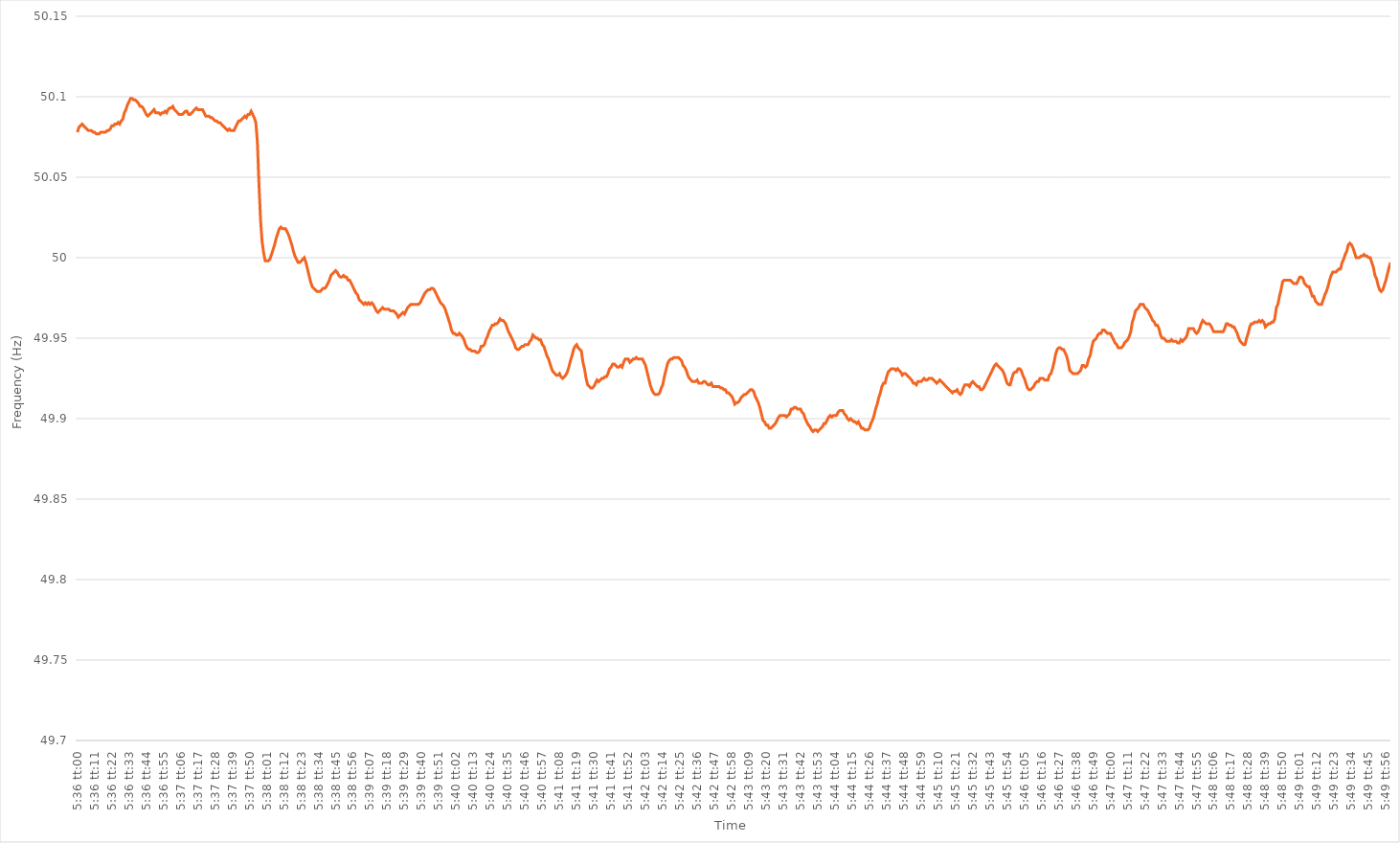
| Category | Series 0 |
|---|---|
| 0.2333333333333333 | 50.078 |
| 0.2333449074074074 | 50.081 |
| 0.23335648148148147 | 50.082 |
| 0.23336805555555554 | 50.083 |
| 0.23337962962962963 | 50.082 |
| 0.2333912037037037 | 50.081 |
| 0.23340277777777776 | 50.08 |
| 0.23341435185185186 | 50.079 |
| 0.23342592592592593 | 50.079 |
| 0.2334375 | 50.079 |
| 0.2334490740740741 | 50.078 |
| 0.23346064814814815 | 50.078 |
| 0.23347222222222222 | 50.077 |
| 0.23348379629629631 | 50.077 |
| 0.23349537037037038 | 50.077 |
| 0.23350694444444445 | 50.078 |
| 0.23351851851851854 | 50.078 |
| 0.23353009259259258 | 50.078 |
| 0.23354166666666668 | 50.078 |
| 0.23355324074074071 | 50.079 |
| 0.23356481481481484 | 50.079 |
| 0.23357638888888888 | 50.08 |
| 0.23358796296296294 | 50.082 |
| 0.23359953703703704 | 50.082 |
| 0.2336111111111111 | 50.083 |
| 0.23362268518518517 | 50.083 |
| 0.23363425925925926 | 50.084 |
| 0.23364583333333333 | 50.083 |
| 0.2336574074074074 | 50.085 |
| 0.2336689814814815 | 50.086 |
| 0.23368055555555556 | 50.09 |
| 0.23369212962962962 | 50.092 |
| 0.23370370370370372 | 50.095 |
| 0.23371527777777779 | 50.097 |
| 0.23372685185185185 | 50.099 |
| 0.23373842592592595 | 50.099 |
| 0.23375 | 50.098 |
| 0.23376157407407408 | 50.098 |
| 0.23377314814814812 | 50.097 |
| 0.23378472222222224 | 50.096 |
| 0.23379629629629628 | 50.094 |
| 0.23380787037037035 | 50.094 |
| 0.23381944444444444 | 50.093 |
| 0.2338310185185185 | 50.091 |
| 0.23384259259259257 | 50.089 |
| 0.23385416666666667 | 50.088 |
| 0.23386574074074074 | 50.089 |
| 0.2338773148148148 | 50.09 |
| 0.2338888888888889 | 50.091 |
| 0.23390046296296296 | 50.092 |
| 0.23391203703703703 | 50.09 |
| 0.23392361111111112 | 50.09 |
| 0.2339351851851852 | 50.09 |
| 0.23394675925925926 | 50.089 |
| 0.23395833333333335 | 50.09 |
| 0.23396990740740742 | 50.09 |
| 0.23398148148148148 | 50.091 |
| 0.23399305555555558 | 50.09 |
| 0.23400462962962965 | 50.092 |
| 0.23401620370370368 | 50.093 |
| 0.2340277777777778 | 50.093 |
| 0.23403935185185185 | 50.094 |
| 0.2340509259259259 | 50.092 |
| 0.23406249999999998 | 50.091 |
| 0.23407407407407407 | 50.09 |
| 0.23408564814814814 | 50.089 |
| 0.2340972222222222 | 50.089 |
| 0.2341087962962963 | 50.089 |
| 0.23412037037037037 | 50.09 |
| 0.23413194444444443 | 50.091 |
| 0.23414351851851853 | 50.091 |
| 0.2341550925925926 | 50.089 |
| 0.23416666666666666 | 50.089 |
| 0.23417824074074076 | 50.09 |
| 0.23418981481481482 | 50.091 |
| 0.2342013888888889 | 50.092 |
| 0.23421296296296298 | 50.093 |
| 0.23422453703703705 | 50.092 |
| 0.2342361111111111 | 50.092 |
| 0.2342476851851852 | 50.092 |
| 0.23425925925925925 | 50.092 |
| 0.23427083333333334 | 50.09 |
| 0.23428240740740738 | 50.088 |
| 0.23429398148148148 | 50.088 |
| 0.23430555555555554 | 50.088 |
| 0.2343171296296296 | 50.087 |
| 0.2343287037037037 | 50.087 |
| 0.23434027777777777 | 50.086 |
| 0.23435185185185184 | 50.085 |
| 0.23436342592592593 | 50.085 |
| 0.234375 | 50.084 |
| 0.23438657407407407 | 50.084 |
| 0.23439814814814816 | 50.083 |
| 0.23440972222222223 | 50.082 |
| 0.2344212962962963 | 50.081 |
| 0.2344328703703704 | 50.08 |
| 0.23444444444444446 | 50.079 |
| 0.23445601851851852 | 50.08 |
| 0.23446759259259262 | 50.079 |
| 0.23447916666666666 | 50.079 |
| 0.23449074074074075 | 50.079 |
| 0.2345023148148148 | 50.081 |
| 0.2345138888888889 | 50.083 |
| 0.23452546296296295 | 50.085 |
| 0.23453703703703702 | 50.085 |
| 0.2345486111111111 | 50.086 |
| 0.23456018518518518 | 50.087 |
| 0.23457175925925924 | 50.088 |
| 0.23458333333333334 | 50.087 |
| 0.2345949074074074 | 50.089 |
| 0.23460648148148147 | 50.089 |
| 0.23461805555555557 | 50.091 |
| 0.23462962962962963 | 50.089 |
| 0.2346412037037037 | 50.087 |
| 0.2346527777777778 | 50.084 |
| 0.23466435185185186 | 50.072 |
| 0.23467592592592593 | 50.046 |
| 0.23468750000000002 | 50.024 |
| 0.2346990740740741 | 50.01 |
| 0.23471064814814815 | 50.003 |
| 0.2347222222222222 | 49.998 |
| 0.23473379629629632 | 49.998 |
| 0.23474537037037035 | 49.998 |
| 0.23475694444444442 | 49.999 |
| 0.23476851851851852 | 50.002 |
| 0.23478009259259258 | 50.005 |
| 0.23479166666666665 | 50.008 |
| 0.23480324074074074 | 50.012 |
| 0.2348148148148148 | 50.015 |
| 0.23482638888888888 | 50.018 |
| 0.23483796296296297 | 50.019 |
| 0.23484953703703704 | 50.018 |
| 0.2348611111111111 | 50.018 |
| 0.2348726851851852 | 50.018 |
| 0.23488425925925926 | 50.016 |
| 0.23489583333333333 | 50.014 |
| 0.23490740740740743 | 50.011 |
| 0.2349189814814815 | 50.008 |
| 0.23493055555555556 | 50.004 |
| 0.23494212962962965 | 50.001 |
| 0.23495370370370372 | 49.999 |
| 0.23496527777777776 | 49.997 |
| 0.23497685185185188 | 49.997 |
| 0.23498842592592592 | 49.998 |
| 0.235 | 49.999 |
| 0.23501157407407405 | 50 |
| 0.23502314814814815 | 49.997 |
| 0.23503472222222221 | 49.993 |
| 0.23504629629629628 | 49.989 |
| 0.23505787037037038 | 49.985 |
| 0.23506944444444444 | 49.982 |
| 0.2350810185185185 | 49.981 |
| 0.2350925925925926 | 49.98 |
| 0.23510416666666667 | 49.979 |
| 0.23511574074074074 | 49.979 |
| 0.23512731481481483 | 49.979 |
| 0.2351388888888889 | 49.98 |
| 0.23515046296296296 | 49.981 |
| 0.23516203703703706 | 49.981 |
| 0.23517361111111112 | 49.982 |
| 0.23518518518518516 | 49.984 |
| 0.23519675925925929 | 49.986 |
| 0.23520833333333332 | 49.989 |
| 0.23521990740740742 | 49.99 |
| 0.23523148148148146 | 49.991 |
| 0.23524305555555555 | 49.992 |
| 0.23525462962962962 | 49.991 |
| 0.23526620370370369 | 49.989 |
| 0.23527777777777778 | 49.988 |
| 0.23528935185185185 | 49.988 |
| 0.2353009259259259 | 49.989 |
| 0.2353125 | 49.988 |
| 0.23532407407407407 | 49.988 |
| 0.23533564814814814 | 49.986 |
| 0.23534722222222224 | 49.986 |
| 0.2353587962962963 | 49.984 |
| 0.23537037037037037 | 49.982 |
| 0.23538194444444446 | 49.98 |
| 0.23539351851851853 | 49.978 |
| 0.2354050925925926 | 49.977 |
| 0.2354166666666667 | 49.974 |
| 0.23542824074074073 | 49.973 |
| 0.23543981481481482 | 49.972 |
| 0.23545138888888886 | 49.971 |
| 0.23546296296296299 | 49.972 |
| 0.23547453703703702 | 49.971 |
| 0.2354861111111111 | 49.972 |
| 0.23549768518518518 | 49.971 |
| 0.23550925925925925 | 49.972 |
| 0.23552083333333332 | 49.971 |
| 0.2355324074074074 | 49.969 |
| 0.23554398148148148 | 49.967 |
| 0.23555555555555555 | 49.966 |
| 0.23556712962962964 | 49.967 |
| 0.2355787037037037 | 49.968 |
| 0.23559027777777777 | 49.969 |
| 0.23560185185185187 | 49.968 |
| 0.23561342592592593 | 49.968 |
| 0.235625 | 49.968 |
| 0.2356365740740741 | 49.968 |
| 0.23564814814814816 | 49.967 |
| 0.23565972222222223 | 49.967 |
| 0.23567129629629627 | 49.967 |
| 0.2356828703703704 | 49.966 |
| 0.23569444444444443 | 49.965 |
| 0.2357060185185185 | 49.963 |
| 0.2357175925925926 | 49.964 |
| 0.23572916666666666 | 49.965 |
| 0.23574074074074072 | 49.966 |
| 0.23575231481481482 | 49.965 |
| 0.23576388888888888 | 49.967 |
| 0.23577546296296295 | 49.969 |
| 0.23578703703703704 | 49.97 |
| 0.2357986111111111 | 49.971 |
| 0.23581018518518518 | 49.971 |
| 0.23582175925925927 | 49.971 |
| 0.23583333333333334 | 49.971 |
| 0.2358449074074074 | 49.971 |
| 0.2358564814814815 | 49.971 |
| 0.23586805555555557 | 49.972 |
| 0.23587962962962963 | 49.974 |
| 0.23589120370370367 | 49.976 |
| 0.2359027777777778 | 49.978 |
| 0.23591435185185183 | 49.979 |
| 0.23592592592592596 | 49.98 |
| 0.2359375 | 49.98 |
| 0.23594907407407406 | 49.981 |
| 0.23596064814814813 | 49.981 |
| 0.23597222222222222 | 49.98 |
| 0.2359837962962963 | 49.978 |
| 0.23599537037037036 | 49.976 |
| 0.23600694444444445 | 49.974 |
| 0.23601851851851852 | 49.972 |
| 0.23603009259259258 | 49.971 |
| 0.23604166666666668 | 49.97 |
| 0.23605324074074074 | 49.968 |
| 0.2360648148148148 | 49.965 |
| 0.2360763888888889 | 49.962 |
| 0.23608796296296297 | 49.959 |
| 0.23609953703703704 | 49.955 |
| 0.23611111111111113 | 49.953 |
| 0.2361226851851852 | 49.953 |
| 0.23613425925925924 | 49.952 |
| 0.23614583333333336 | 49.952 |
| 0.2361574074074074 | 49.953 |
| 0.2361689814814815 | 49.952 |
| 0.23618055555555553 | 49.951 |
| 0.23619212962962963 | 49.949 |
| 0.2362037037037037 | 49.946 |
| 0.23621527777777776 | 49.944 |
| 0.23622685185185185 | 49.943 |
| 0.23623842592592592 | 49.943 |
| 0.23625 | 49.942 |
| 0.23626157407407408 | 49.942 |
| 0.23627314814814815 | 49.942 |
| 0.23628472222222222 | 49.941 |
| 0.2362962962962963 | 49.941 |
| 0.23630787037037038 | 49.942 |
| 0.23631944444444444 | 49.945 |
| 0.23633101851851854 | 49.945 |
| 0.2363425925925926 | 49.946 |
| 0.23635416666666667 | 49.949 |
| 0.23636574074074077 | 49.951 |
| 0.2363773148148148 | 49.954 |
| 0.2363888888888889 | 49.956 |
| 0.23640046296296294 | 49.958 |
| 0.23641203703703703 | 49.958 |
| 0.2364236111111111 | 49.959 |
| 0.23643518518518516 | 49.959 |
| 0.23644675925925926 | 49.96 |
| 0.23645833333333333 | 49.962 |
| 0.2364699074074074 | 49.961 |
| 0.2364814814814815 | 49.961 |
| 0.23649305555555555 | 49.96 |
| 0.23650462962962962 | 49.958 |
| 0.23651620370370371 | 49.955 |
| 0.23652777777777778 | 49.953 |
| 0.23653935185185185 | 49.951 |
| 0.23655092592592594 | 49.949 |
| 0.2365625 | 49.947 |
| 0.23657407407407408 | 49.944 |
| 0.23658564814814817 | 49.943 |
| 0.23659722222222224 | 49.943 |
| 0.2366087962962963 | 49.944 |
| 0.23662037037037034 | 49.945 |
| 0.23663194444444446 | 49.945 |
| 0.2366435185185185 | 49.946 |
| 0.23665509259259257 | 49.946 |
| 0.23666666666666666 | 49.946 |
| 0.23667824074074073 | 49.948 |
| 0.2366898148148148 | 49.949 |
| 0.2367013888888889 | 49.952 |
| 0.23671296296296296 | 49.951 |
| 0.23672453703703702 | 49.95 |
| 0.23673611111111112 | 49.95 |
| 0.23674768518518519 | 49.949 |
| 0.23675925925925925 | 49.949 |
| 0.23677083333333335 | 49.946 |
| 0.2367824074074074 | 49.945 |
| 0.23679398148148148 | 49.942 |
| 0.23680555555555557 | 49.939 |
| 0.23681712962962964 | 49.937 |
| 0.2368287037037037 | 49.934 |
| 0.23684027777777775 | 49.931 |
| 0.23685185185185187 | 49.929 |
| 0.2368634259259259 | 49.928 |
| 0.23687500000000003 | 49.927 |
| 0.23688657407407407 | 49.927 |
| 0.23689814814814814 | 49.928 |
| 0.2369097222222222 | 49.926 |
| 0.2369212962962963 | 49.925 |
| 0.23693287037037036 | 49.926 |
| 0.23694444444444443 | 49.927 |
| 0.23695601851851852 | 49.929 |
| 0.2369675925925926 | 49.932 |
| 0.23697916666666666 | 49.936 |
| 0.23699074074074075 | 49.939 |
| 0.23700231481481482 | 49.943 |
| 0.23701388888888889 | 49.945 |
| 0.23702546296296298 | 49.946 |
| 0.23703703703703705 | 49.944 |
| 0.2370486111111111 | 49.943 |
| 0.2370601851851852 | 49.942 |
| 0.23707175925925927 | 49.935 |
| 0.2370833333333333 | 49.931 |
| 0.23709490740740743 | 49.925 |
| 0.23710648148148147 | 49.921 |
| 0.23711805555555557 | 49.92 |
| 0.2371296296296296 | 49.919 |
| 0.2371412037037037 | 49.919 |
| 0.23715277777777777 | 49.92 |
| 0.23716435185185183 | 49.922 |
| 0.23717592592592593 | 49.924 |
| 0.2371875 | 49.923 |
| 0.23719907407407406 | 49.924 |
| 0.23721064814814816 | 49.925 |
| 0.23722222222222222 | 49.925 |
| 0.2372337962962963 | 49.926 |
| 0.23724537037037038 | 49.926 |
| 0.23725694444444445 | 49.928 |
| 0.23726851851851852 | 49.931 |
| 0.2372800925925926 | 49.932 |
| 0.23729166666666668 | 49.934 |
| 0.23730324074074075 | 49.934 |
| 0.23731481481481484 | 49.933 |
| 0.23732638888888888 | 49.932 |
| 0.23733796296296297 | 49.932 |
| 0.237349537037037 | 49.933 |
| 0.2373611111111111 | 49.932 |
| 0.23737268518518517 | 49.935 |
| 0.23738425925925924 | 49.937 |
| 0.23739583333333333 | 49.937 |
| 0.2374074074074074 | 49.937 |
| 0.23741898148148147 | 49.935 |
| 0.23743055555555556 | 49.936 |
| 0.23744212962962963 | 49.937 |
| 0.2374537037037037 | 49.937 |
| 0.2374652777777778 | 49.938 |
| 0.23747685185185186 | 49.937 |
| 0.23748842592592592 | 49.937 |
| 0.23750000000000002 | 49.937 |
| 0.23751157407407408 | 49.937 |
| 0.23752314814814815 | 49.935 |
| 0.23753472222222224 | 49.933 |
| 0.2375462962962963 | 49.929 |
| 0.23755787037037038 | 49.925 |
| 0.23756944444444442 | 49.921 |
| 0.23758101851851854 | 49.918 |
| 0.23759259259259258 | 49.916 |
| 0.23760416666666664 | 49.915 |
| 0.23761574074074074 | 49.915 |
| 0.2376273148148148 | 49.915 |
| 0.23763888888888887 | 49.916 |
| 0.23765046296296297 | 49.919 |
| 0.23766203703703703 | 49.921 |
| 0.2376736111111111 | 49.926 |
| 0.2376851851851852 | 49.93 |
| 0.23769675925925926 | 49.934 |
| 0.23770833333333333 | 49.936 |
| 0.23771990740740742 | 49.937 |
| 0.2377314814814815 | 49.937 |
| 0.23774305555555555 | 49.938 |
| 0.23775462962962965 | 49.938 |
| 0.23776620370370372 | 49.938 |
| 0.23777777777777778 | 49.938 |
| 0.23778935185185182 | 49.937 |
| 0.23780092592592594 | 49.936 |
| 0.23781249999999998 | 49.933 |
| 0.2378240740740741 | 49.932 |
| 0.23783564814814814 | 49.93 |
| 0.2378472222222222 | 49.927 |
| 0.23785879629629628 | 49.925 |
| 0.23787037037037037 | 49.924 |
| 0.23788194444444444 | 49.923 |
| 0.2378935185185185 | 49.923 |
| 0.2379050925925926 | 49.923 |
| 0.23791666666666667 | 49.924 |
| 0.23792824074074073 | 49.922 |
| 0.23793981481481483 | 49.922 |
| 0.2379513888888889 | 49.922 |
| 0.23796296296296296 | 49.923 |
| 0.23797453703703705 | 49.923 |
| 0.23798611111111112 | 49.922 |
| 0.2379976851851852 | 49.921 |
| 0.23800925925925928 | 49.921 |
| 0.23802083333333335 | 49.922 |
| 0.2380324074074074 | 49.92 |
| 0.2380439814814815 | 49.92 |
| 0.23805555555555555 | 49.92 |
| 0.23806712962962964 | 49.92 |
| 0.23807870370370368 | 49.92 |
| 0.23809027777777778 | 49.919 |
| 0.23810185185185184 | 49.919 |
| 0.2381134259259259 | 49.918 |
| 0.238125 | 49.918 |
| 0.23813657407407407 | 49.916 |
| 0.23814814814814814 | 49.916 |
| 0.23815972222222223 | 49.915 |
| 0.2381712962962963 | 49.914 |
| 0.23818287037037036 | 49.912 |
| 0.23819444444444446 | 49.909 |
| 0.23820601851851853 | 49.91 |
| 0.2382175925925926 | 49.91 |
| 0.2382291666666667 | 49.911 |
| 0.23824074074074075 | 49.913 |
| 0.23825231481481482 | 49.914 |
| 0.23826388888888891 | 49.915 |
| 0.23827546296296295 | 49.915 |
| 0.23828703703703705 | 49.916 |
| 0.23829861111111109 | 49.917 |
| 0.23831018518518518 | 49.918 |
| 0.23832175925925925 | 49.918 |
| 0.2383333333333333 | 49.917 |
| 0.2383449074074074 | 49.914 |
| 0.23835648148148147 | 49.912 |
| 0.23836805555555554 | 49.91 |
| 0.23837962962962964 | 49.907 |
| 0.2383912037037037 | 49.903 |
| 0.23840277777777777 | 49.899 |
| 0.23841435185185186 | 49.898 |
| 0.23842592592592593 | 49.896 |
| 0.2384375 | 49.896 |
| 0.2384490740740741 | 49.894 |
| 0.23846064814814816 | 49.894 |
| 0.23847222222222222 | 49.895 |
| 0.23848379629629632 | 49.896 |
| 0.23849537037037036 | 49.897 |
| 0.23850694444444445 | 49.899 |
| 0.2385185185185185 | 49.901 |
| 0.2385300925925926 | 49.902 |
| 0.23854166666666665 | 49.902 |
| 0.23855324074074072 | 49.902 |
| 0.2385648148148148 | 49.902 |
| 0.23857638888888888 | 49.901 |
| 0.23858796296296295 | 49.902 |
| 0.23859953703703704 | 49.903 |
| 0.2386111111111111 | 49.906 |
| 0.23862268518518517 | 49.906 |
| 0.23863425925925927 | 49.907 |
| 0.23864583333333333 | 49.907 |
| 0.2386574074074074 | 49.906 |
| 0.2386689814814815 | 49.906 |
| 0.23868055555555556 | 49.906 |
| 0.23869212962962963 | 49.904 |
| 0.23870370370370372 | 49.903 |
| 0.2387152777777778 | 49.9 |
| 0.23872685185185186 | 49.898 |
| 0.2387384259259259 | 49.896 |
| 0.23875000000000002 | 49.895 |
| 0.23876157407407406 | 49.893 |
| 0.23877314814814818 | 49.892 |
| 0.23878472222222222 | 49.893 |
| 0.23879629629629628 | 49.893 |
| 0.23880787037037035 | 49.892 |
| 0.23881944444444445 | 49.893 |
| 0.2388310185185185 | 49.894 |
| 0.23884259259259258 | 49.895 |
| 0.23885416666666667 | 49.897 |
| 0.23886574074074074 | 49.897 |
| 0.2388773148148148 | 49.899 |
| 0.2388888888888889 | 49.901 |
| 0.23890046296296297 | 49.902 |
| 0.23891203703703703 | 49.901 |
| 0.23892361111111113 | 49.902 |
| 0.2389351851851852 | 49.902 |
| 0.23894675925925926 | 49.902 |
| 0.23895833333333336 | 49.904 |
| 0.23896990740740742 | 49.905 |
| 0.23898148148148146 | 49.905 |
| 0.23899305555555558 | 49.905 |
| 0.23900462962962962 | 49.903 |
| 0.2390162037037037 | 49.902 |
| 0.23902777777777776 | 49.9 |
| 0.23903935185185185 | 49.899 |
| 0.23905092592592592 | 49.9 |
| 0.23906249999999998 | 49.899 |
| 0.23907407407407408 | 49.898 |
| 0.23908564814814814 | 49.898 |
| 0.2390972222222222 | 49.897 |
| 0.2391087962962963 | 49.898 |
| 0.23912037037037037 | 49.896 |
| 0.23913194444444444 | 49.894 |
| 0.23914351851851853 | 49.894 |
| 0.2391550925925926 | 49.893 |
| 0.23916666666666667 | 49.893 |
| 0.23917824074074076 | 49.893 |
| 0.23918981481481483 | 49.894 |
| 0.2392013888888889 | 49.897 |
| 0.239212962962963 | 49.899 |
| 0.23922453703703703 | 49.902 |
| 0.23923611111111112 | 49.906 |
| 0.23924768518518516 | 49.909 |
| 0.23925925925925925 | 49.913 |
| 0.23927083333333332 | 49.916 |
| 0.2392824074074074 | 49.92 |
| 0.23929398148148148 | 49.922 |
| 0.23930555555555555 | 49.922 |
| 0.23931712962962962 | 49.926 |
| 0.2393287037037037 | 49.929 |
| 0.23934027777777778 | 49.93 |
| 0.23935185185185184 | 49.931 |
| 0.23936342592592594 | 49.931 |
| 0.239375 | 49.931 |
| 0.23938657407407407 | 49.93 |
| 0.23939814814814817 | 49.931 |
| 0.23940972222222223 | 49.93 |
| 0.2394212962962963 | 49.929 |
| 0.2394328703703704 | 49.927 |
| 0.23944444444444443 | 49.928 |
| 0.23945601851851853 | 49.928 |
| 0.23946759259259257 | 49.927 |
| 0.2394791666666667 | 49.926 |
| 0.23949074074074073 | 49.925 |
| 0.2395023148148148 | 49.924 |
| 0.2395138888888889 | 49.922 |
| 0.23952546296296295 | 49.922 |
| 0.23953703703703702 | 49.921 |
| 0.23954861111111111 | 49.923 |
| 0.23956018518518518 | 49.923 |
| 0.23957175925925925 | 49.923 |
| 0.23958333333333334 | 49.924 |
| 0.2395949074074074 | 49.925 |
| 0.23960648148148148 | 49.924 |
| 0.23961805555555557 | 49.924 |
| 0.23962962962962964 | 49.925 |
| 0.2396412037037037 | 49.925 |
| 0.2396527777777778 | 49.925 |
| 0.23966435185185186 | 49.924 |
| 0.23967592592592593 | 49.923 |
| 0.23968749999999997 | 49.922 |
| 0.2396990740740741 | 49.923 |
| 0.23971064814814813 | 49.924 |
| 0.23972222222222225 | 49.923 |
| 0.2397337962962963 | 49.922 |
| 0.23974537037037036 | 49.921 |
| 0.23975694444444443 | 49.92 |
| 0.23976851851851852 | 49.919 |
| 0.2397800925925926 | 49.918 |
| 0.23979166666666665 | 49.917 |
| 0.23980324074074075 | 49.916 |
| 0.23981481481481481 | 49.917 |
| 0.23982638888888888 | 49.917 |
| 0.23983796296296298 | 49.918 |
| 0.23984953703703704 | 49.916 |
| 0.2398611111111111 | 49.915 |
| 0.2398726851851852 | 49.916 |
| 0.23988425925925927 | 49.919 |
| 0.23989583333333334 | 49.921 |
| 0.23990740740740743 | 49.921 |
| 0.2399189814814815 | 49.921 |
| 0.23993055555555554 | 49.92 |
| 0.23994212962962966 | 49.922 |
| 0.2399537037037037 | 49.923 |
| 0.23996527777777776 | 49.922 |
| 0.23997685185185183 | 49.921 |
| 0.23998842592592592 | 49.92 |
| 0.24 | 49.92 |
| 0.24001157407407406 | 49.918 |
| 0.24002314814814815 | 49.918 |
| 0.24003472222222222 | 49.919 |
| 0.24004629629629629 | 49.921 |
| 0.24005787037037038 | 49.923 |
| 0.24006944444444445 | 49.925 |
| 0.2400810185185185 | 49.927 |
| 0.2400925925925926 | 49.929 |
| 0.24010416666666667 | 49.931 |
| 0.24011574074074074 | 49.933 |
| 0.24012731481481484 | 49.934 |
| 0.2401388888888889 | 49.933 |
| 0.24015046296296297 | 49.932 |
| 0.24016203703703706 | 49.931 |
| 0.2401736111111111 | 49.93 |
| 0.2401851851851852 | 49.928 |
| 0.24019675925925923 | 49.925 |
| 0.24020833333333333 | 49.922 |
| 0.2402199074074074 | 49.921 |
| 0.24023148148148146 | 49.921 |
| 0.24024305555555556 | 49.925 |
| 0.24025462962962962 | 49.928 |
| 0.2402662037037037 | 49.929 |
| 0.24027777777777778 | 49.929 |
| 0.24028935185185185 | 49.931 |
| 0.24030092592592592 | 49.931 |
| 0.2403125 | 49.93 |
| 0.24032407407407408 | 49.927 |
| 0.24033564814814815 | 49.925 |
| 0.24034722222222224 | 49.922 |
| 0.2403587962962963 | 49.919 |
| 0.24037037037037037 | 49.918 |
| 0.24038194444444447 | 49.918 |
| 0.2403935185185185 | 49.919 |
| 0.2404050925925926 | 49.92 |
| 0.24041666666666664 | 49.922 |
| 0.24042824074074076 | 49.923 |
| 0.2404398148148148 | 49.923 |
| 0.24045138888888887 | 49.925 |
| 0.24046296296296296 | 49.925 |
| 0.24047453703703703 | 49.925 |
| 0.2404861111111111 | 49.924 |
| 0.2404976851851852 | 49.924 |
| 0.24050925925925926 | 49.924 |
| 0.24052083333333332 | 49.927 |
| 0.24053240740740742 | 49.928 |
| 0.24054398148148148 | 49.931 |
| 0.24055555555555555 | 49.935 |
| 0.24056712962962964 | 49.94 |
| 0.2405787037037037 | 49.943 |
| 0.24059027777777778 | 49.944 |
| 0.24060185185185187 | 49.944 |
| 0.24061342592592594 | 49.943 |
| 0.240625 | 49.943 |
| 0.24063657407407404 | 49.941 |
| 0.24064814814814817 | 49.939 |
| 0.2406597222222222 | 49.935 |
| 0.24067129629629633 | 49.93 |
| 0.24068287037037037 | 49.929 |
| 0.24069444444444443 | 49.928 |
| 0.2407060185185185 | 49.928 |
| 0.2407175925925926 | 49.928 |
| 0.24072916666666666 | 49.928 |
| 0.24074074074074073 | 49.929 |
| 0.24075231481481482 | 49.93 |
| 0.2407638888888889 | 49.933 |
| 0.24077546296296296 | 49.933 |
| 0.24078703703703705 | 49.932 |
| 0.24079861111111112 | 49.933 |
| 0.24081018518518518 | 49.937 |
| 0.24082175925925928 | 49.939 |
| 0.24083333333333334 | 49.944 |
| 0.2408449074074074 | 49.948 |
| 0.2408564814814815 | 49.949 |
| 0.24086805555555557 | 49.95 |
| 0.2408796296296296 | 49.952 |
| 0.24089120370370373 | 49.953 |
| 0.24090277777777777 | 49.953 |
| 0.24091435185185184 | 49.955 |
| 0.2409259259259259 | 49.955 |
| 0.2409375 | 49.954 |
| 0.24094907407407407 | 49.953 |
| 0.24096064814814813 | 49.953 |
| 0.24097222222222223 | 49.953 |
| 0.2409837962962963 | 49.951 |
| 0.24099537037037036 | 49.949 |
| 0.24100694444444445 | 49.947 |
| 0.24101851851851852 | 49.946 |
| 0.2410300925925926 | 49.944 |
| 0.24104166666666668 | 49.944 |
| 0.24105324074074075 | 49.944 |
| 0.24106481481481482 | 49.945 |
| 0.2410763888888889 | 49.947 |
| 0.24108796296296298 | 49.948 |
| 0.24109953703703701 | 49.949 |
| 0.24111111111111114 | 49.951 |
| 0.24112268518518518 | 49.954 |
| 0.24113425925925927 | 49.96 |
| 0.2411458333333333 | 49.963 |
| 0.2411574074074074 | 49.967 |
| 0.24116898148148147 | 49.968 |
| 0.24118055555555554 | 49.969 |
| 0.24119212962962963 | 49.971 |
| 0.2412037037037037 | 49.971 |
| 0.24121527777777776 | 49.971 |
| 0.24122685185185186 | 49.969 |
| 0.24123842592592593 | 49.968 |
| 0.24125 | 49.967 |
| 0.2412615740740741 | 49.965 |
| 0.24127314814814815 | 49.963 |
| 0.24128472222222222 | 49.961 |
| 0.24129629629629631 | 49.96 |
| 0.24130787037037038 | 49.958 |
| 0.24131944444444445 | 49.958 |
| 0.24133101851851854 | 49.956 |
| 0.24134259259259258 | 49.952 |
| 0.24135416666666668 | 49.95 |
| 0.24136574074074071 | 49.95 |
| 0.24137731481481484 | 49.949 |
| 0.24138888888888888 | 49.948 |
| 0.24140046296296294 | 49.948 |
| 0.24141203703703704 | 49.948 |
| 0.2414236111111111 | 49.949 |
| 0.24143518518518517 | 49.948 |
| 0.24144675925925926 | 49.948 |
| 0.24145833333333333 | 49.948 |
| 0.2414699074074074 | 49.947 |
| 0.2414814814814815 | 49.947 |
| 0.24149305555555556 | 49.949 |
| 0.24150462962962962 | 49.948 |
| 0.24151620370370372 | 49.949 |
| 0.24152777777777779 | 49.95 |
| 0.24153935185185185 | 49.952 |
| 0.24155092592592595 | 49.956 |
| 0.2415625 | 49.956 |
| 0.24157407407407408 | 49.956 |
| 0.24158564814814812 | 49.956 |
| 0.24159722222222224 | 49.954 |
| 0.24160879629629628 | 49.953 |
| 0.24162037037037035 | 49.954 |
| 0.24163194444444444 | 49.956 |
| 0.2416435185185185 | 49.959 |
| 0.24165509259259257 | 49.961 |
| 0.24166666666666667 | 49.96 |
| 0.24167824074074074 | 49.959 |
| 0.2416898148148148 | 49.959 |
| 0.2417013888888889 | 49.959 |
| 0.24171296296296296 | 49.958 |
| 0.24172453703703703 | 49.956 |
| 0.24173611111111112 | 49.954 |
| 0.2417476851851852 | 49.954 |
| 0.24175925925925926 | 49.954 |
| 0.24177083333333335 | 49.954 |
| 0.24178240740740742 | 49.954 |
| 0.24179398148148148 | 49.954 |
| 0.24180555555555558 | 49.954 |
| 0.24181712962962965 | 49.956 |
| 0.24182870370370368 | 49.959 |
| 0.2418402777777778 | 49.959 |
| 0.24185185185185185 | 49.958 |
| 0.2418634259259259 | 49.958 |
| 0.24187499999999998 | 49.957 |
| 0.24188657407407407 | 49.957 |
| 0.24189814814814814 | 49.955 |
| 0.2419097222222222 | 49.953 |
| 0.2419212962962963 | 49.95 |
| 0.24193287037037037 | 49.948 |
| 0.24194444444444443 | 49.947 |
| 0.24195601851851853 | 49.946 |
| 0.2419675925925926 | 49.946 |
| 0.24197916666666666 | 49.95 |
| 0.24199074074074076 | 49.953 |
| 0.24200231481481482 | 49.957 |
| 0.2420138888888889 | 49.959 |
| 0.24202546296296298 | 49.959 |
| 0.24203703703703705 | 49.96 |
| 0.2420486111111111 | 49.96 |
| 0.2420601851851852 | 49.96 |
| 0.24207175925925925 | 49.961 |
| 0.24208333333333334 | 49.96 |
| 0.24209490740740738 | 49.961 |
| 0.24210648148148148 | 49.96 |
| 0.24211805555555554 | 49.957 |
| 0.2421296296296296 | 49.958 |
| 0.2421412037037037 | 49.959 |
| 0.24215277777777777 | 49.959 |
| 0.24216435185185184 | 49.96 |
| 0.24217592592592593 | 49.96 |
| 0.2421875 | 49.962 |
| 0.24219907407407407 | 49.969 |
| 0.24221064814814816 | 49.971 |
| 0.24222222222222223 | 49.976 |
| 0.2422337962962963 | 49.98 |
| 0.2422453703703704 | 49.985 |
| 0.24225694444444446 | 49.986 |
| 0.24226851851851852 | 49.986 |
| 0.24228009259259262 | 49.986 |
| 0.24229166666666666 | 49.986 |
| 0.24230324074074075 | 49.986 |
| 0.2423148148148148 | 49.985 |
| 0.2423263888888889 | 49.984 |
| 0.24233796296296295 | 49.984 |
| 0.24234953703703702 | 49.984 |
| 0.2423611111111111 | 49.986 |
| 0.24237268518518518 | 49.988 |
| 0.24238425925925924 | 49.988 |
| 0.24239583333333334 | 49.987 |
| 0.2424074074074074 | 49.984 |
| 0.24241898148148147 | 49.983 |
| 0.24243055555555557 | 49.982 |
| 0.24244212962962963 | 49.982 |
| 0.2424537037037037 | 49.979 |
| 0.2424652777777778 | 49.976 |
| 0.24247685185185186 | 49.976 |
| 0.24248842592592593 | 49.973 |
| 0.24250000000000002 | 49.972 |
| 0.2425115740740741 | 49.971 |
| 0.24252314814814815 | 49.971 |
| 0.2425347222222222 | 49.971 |
| 0.24254629629629632 | 49.974 |
| 0.24255787037037035 | 49.977 |
| 0.24256944444444442 | 49.979 |
| 0.24258101851851852 | 49.982 |
| 0.24259259259259258 | 49.986 |
| 0.24260416666666665 | 49.989 |
| 0.24261574074074074 | 49.991 |
| 0.2426273148148148 | 49.991 |
| 0.24263888888888888 | 49.991 |
| 0.24265046296296297 | 49.992 |
| 0.24266203703703704 | 49.993 |
| 0.2426736111111111 | 49.993 |
| 0.2426851851851852 | 49.997 |
| 0.24269675925925926 | 49.999 |
| 0.24270833333333333 | 50.002 |
| 0.24271990740740743 | 50.004 |
| 0.2427314814814815 | 50.008 |
| 0.24274305555555556 | 50.009 |
| 0.24275462962962965 | 50.008 |
| 0.24276620370370372 | 50.006 |
| 0.24277777777777776 | 50.003 |
| 0.24278935185185188 | 50 |
| 0.24280092592592592 | 50 |
| 0.2428125 | 50 |
| 0.24282407407407405 | 50.001 |
| 0.24283564814814815 | 50.001 |
| 0.24284722222222221 | 50.002 |
| 0.24285879629629628 | 50.001 |
| 0.24287037037037038 | 50.001 |
| 0.24288194444444444 | 50 |
| 0.2428935185185185 | 50 |
| 0.2429050925925926 | 49.997 |
| 0.24291666666666667 | 49.994 |
| 0.24292824074074074 | 49.989 |
| 0.24293981481481483 | 49.987 |
| 0.2429513888888889 | 49.983 |
| 0.24296296296296296 | 49.98 |
| 0.24297453703703706 | 49.979 |
| 0.24298611111111112 | 49.98 |
| 0.24299768518518516 | 49.983 |
| 0.24300925925925929 | 49.986 |
| 0.24302083333333332 | 49.99 |
| 0.24303240740740742 | 49.994 |
| 0.24304398148148146 | 49.997 |